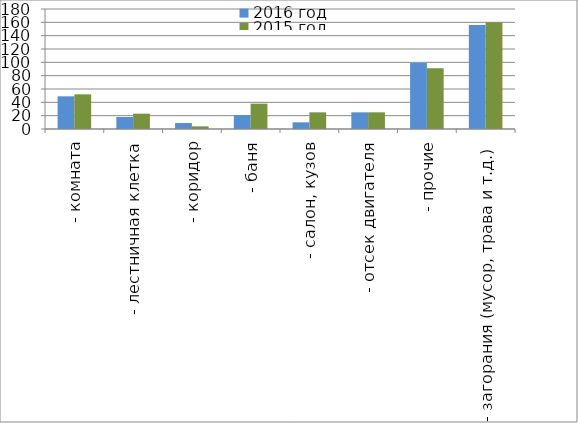
| Category | 2016 год | 2015 год |
|---|---|---|
|  - комната | 49 | 52 |
|  - лестничная клетка | 18 | 23 |
|  - коридор | 9 | 4 |
|  - баня | 21 | 38 |
|  - салон, кузов | 10 | 25 |
|  - отсек двигателя | 25 | 25 |
| - прочие | 99 | 91 |
| - загорания (мусор, трава и т.д.)  | 156 | 160 |